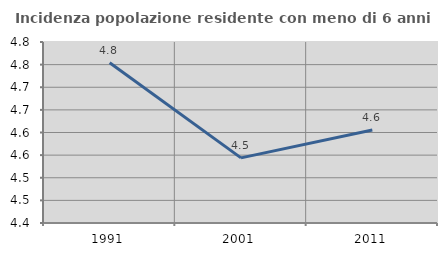
| Category | Incidenza popolazione residente con meno di 6 anni |
|---|---|
| 1991.0 | 4.754 |
| 2001.0 | 4.544 |
| 2011.0 | 4.605 |